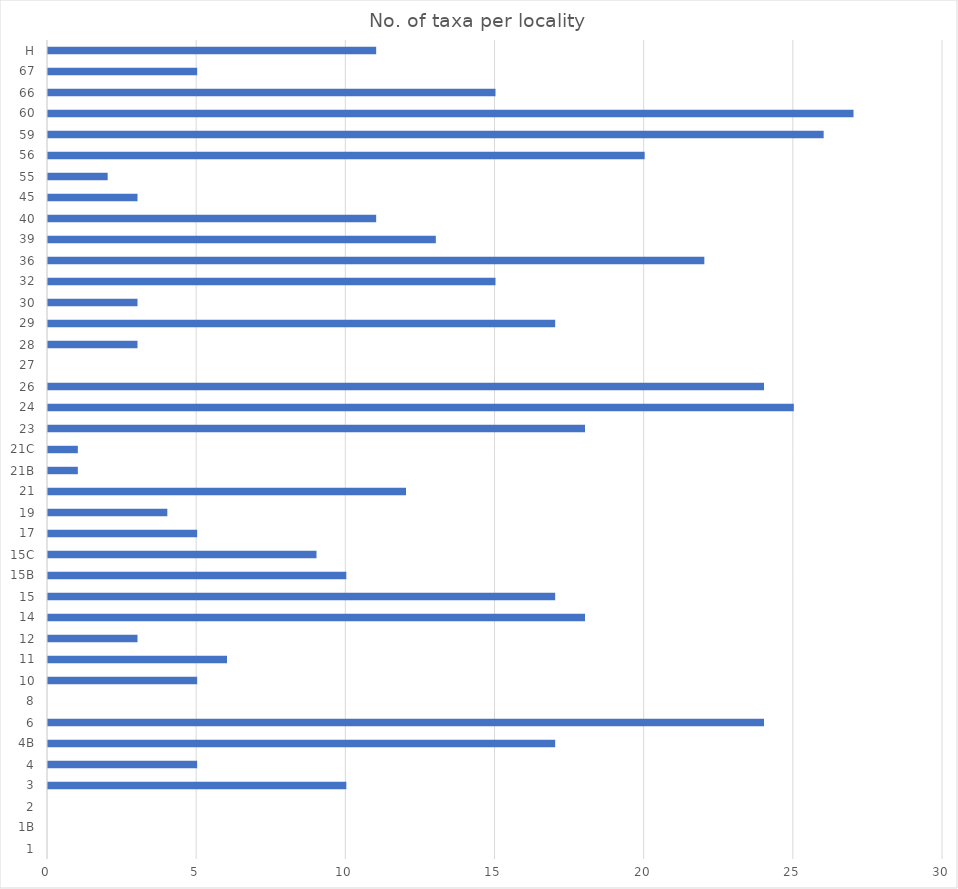
| Category | Series 0 |
|---|---|
| 1 | 0 |
| 1B | 0 |
| 2 | 0 |
| 3 | 10 |
| 4 | 5 |
| 4B | 17 |
| 6 | 24 |
| 8 | 0 |
| 10 | 5 |
| 11 | 6 |
| 12 | 3 |
| 14 | 18 |
| 15 | 17 |
| 15B | 10 |
| 15C | 9 |
| 17 | 5 |
| 19 | 4 |
| 21 | 12 |
| 21B | 1 |
| 21C | 1 |
| 23 | 18 |
| 24 | 25 |
| 26 | 24 |
| 27 | 0 |
| 28 | 3 |
| 29 | 17 |
| 30 | 3 |
| 32 | 15 |
| 36 | 22 |
| 39 | 13 |
| 40 | 11 |
| 45 | 3 |
| 55 | 2 |
| 56 | 20 |
| 59 | 26 |
| 60 | 27 |
| 66 | 15 |
| 67 | 5 |
| H | 11 |